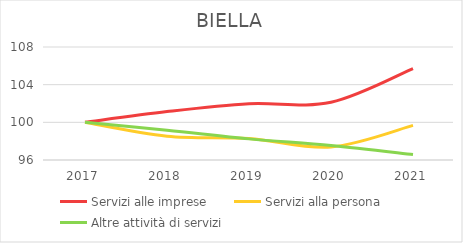
| Category | Servizi alle imprese | Servizi alla persona | Altre attività di servizi |
|---|---|---|---|
| 2017.0 | 100 | 100 | 100 |
| 2018.0 | 101.141 | 98.526 | 99.169 |
| 2019.0 | 101.977 | 98.28 | 98.243 |
| 2020.0 | 102.129 | 97.379 | 97.54 |
| 2021.0 | 105.703 | 99.672 | 96.581 |